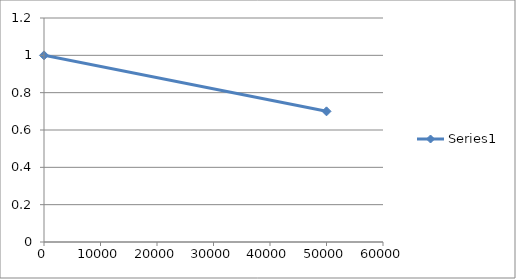
| Category | Series 0 |
|---|---|
| 0.0 | 1 |
| 50000.0 | 0.7 |